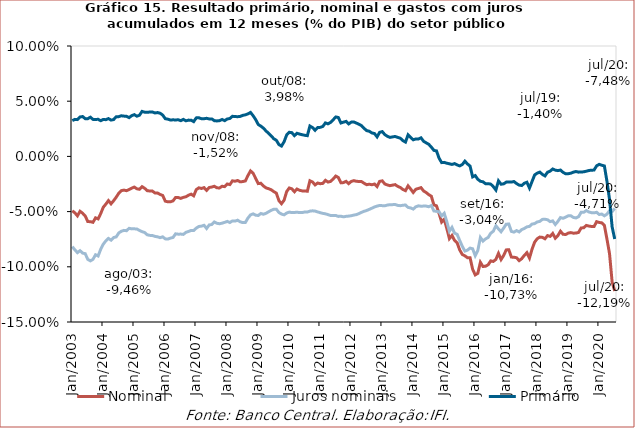
| Category | Nominal | Juros nominais | Primário |
|---|---|---|---|
| 2003-01-01 | -0.049 | -0.082 | 0.032 |
| 2003-02-01 | -0.051 | -0.085 | 0.034 |
| 2003-03-01 | -0.054 | -0.087 | 0.033 |
| 2003-04-01 | -0.05 | -0.085 | 0.036 |
| 2003-05-01 | -0.051 | -0.088 | 0.036 |
| 2003-06-01 | -0.054 | -0.088 | 0.034 |
| 2003-07-01 | -0.059 | -0.093 | 0.034 |
| 2003-08-01 | -0.059 | -0.095 | 0.036 |
| 2003-09-01 | -0.06 | -0.093 | 0.034 |
| 2003-10-01 | -0.056 | -0.089 | 0.033 |
| 2003-11-01 | -0.057 | -0.09 | 0.034 |
| 2003-12-01 | -0.052 | -0.084 | 0.032 |
| 2004-01-01 | -0.046 | -0.079 | 0.033 |
| 2004-02-01 | -0.043 | -0.076 | 0.033 |
| 2004-03-01 | -0.04 | -0.074 | 0.034 |
| 2004-04-01 | -0.043 | -0.076 | 0.033 |
| 2004-05-01 | -0.04 | -0.073 | 0.033 |
| 2004-06-01 | -0.037 | -0.073 | 0.036 |
| 2004-07-01 | -0.033 | -0.069 | 0.036 |
| 2004-08-01 | -0.031 | -0.068 | 0.037 |
| 2004-09-01 | -0.031 | -0.067 | 0.036 |
| 2004-10-01 | -0.031 | -0.067 | 0.036 |
| 2004-11-01 | -0.03 | -0.065 | 0.035 |
| 2004-12-01 | -0.029 | -0.066 | 0.037 |
| 2005-01-01 | -0.028 | -0.066 | 0.038 |
| 2005-02-01 | -0.029 | -0.066 | 0.036 |
| 2005-03-01 | -0.03 | -0.067 | 0.037 |
| 2005-04-01 | -0.027 | -0.068 | 0.041 |
| 2005-05-01 | -0.029 | -0.069 | 0.04 |
| 2005-06-01 | -0.031 | -0.071 | 0.04 |
| 2005-07-01 | -0.031 | -0.072 | 0.04 |
| 2005-08-01 | -0.031 | -0.072 | 0.04 |
| 2005-09-01 | -0.033 | -0.072 | 0.039 |
| 2005-10-01 | -0.033 | -0.073 | 0.04 |
| 2005-11-01 | -0.034 | -0.074 | 0.039 |
| 2005-12-01 | -0.035 | -0.073 | 0.037 |
| 2006-01-01 | -0.041 | -0.075 | 0.034 |
| 2006-02-01 | -0.041 | -0.075 | 0.034 |
| 2006-03-01 | -0.041 | -0.074 | 0.033 |
| 2006-04-01 | -0.04 | -0.073 | 0.033 |
| 2006-05-01 | -0.037 | -0.07 | 0.033 |
| 2006-06-01 | -0.037 | -0.07 | 0.033 |
| 2006-07-01 | -0.038 | -0.07 | 0.032 |
| 2006-08-01 | -0.037 | -0.071 | 0.034 |
| 2006-09-01 | -0.037 | -0.069 | 0.032 |
| 2006-10-01 | -0.035 | -0.068 | 0.033 |
| 2006-11-01 | -0.034 | -0.067 | 0.033 |
| 2006-12-01 | -0.036 | -0.067 | 0.032 |
| 2007-01-01 | -0.03 | -0.065 | 0.035 |
| 2007-02-01 | -0.028 | -0.063 | 0.035 |
| 2007-03-01 | -0.029 | -0.063 | 0.034 |
| 2007-04-01 | -0.028 | -0.062 | 0.034 |
| 2007-05-01 | -0.031 | -0.065 | 0.035 |
| 2007-06-01 | -0.028 | -0.062 | 0.034 |
| 2007-07-01 | -0.028 | -0.062 | 0.034 |
| 2007-08-01 | -0.027 | -0.059 | 0.032 |
| 2007-09-01 | -0.028 | -0.061 | 0.032 |
| 2007-10-01 | -0.029 | -0.061 | 0.032 |
| 2007-11-01 | -0.027 | -0.06 | 0.033 |
| 2007-12-01 | -0.027 | -0.06 | 0.032 |
| 2008-01-01 | -0.025 | -0.059 | 0.034 |
| 2008-02-01 | -0.026 | -0.06 | 0.034 |
| 2008-03-01 | -0.022 | -0.058 | 0.036 |
| 2008-04-01 | -0.022 | -0.059 | 0.036 |
| 2008-05-01 | -0.022 | -0.058 | 0.036 |
| 2008-06-01 | -0.023 | -0.059 | 0.036 |
| 2008-07-01 | -0.023 | -0.06 | 0.037 |
| 2008-08-01 | -0.022 | -0.06 | 0.038 |
| 2008-09-01 | -0.017 | -0.056 | 0.039 |
| 2008-10-01 | -0.013 | -0.053 | 0.04 |
| 2008-11-01 | -0.015 | -0.052 | 0.037 |
| 2008-12-01 | -0.02 | -0.053 | 0.033 |
| 2009-01-01 | -0.025 | -0.054 | 0.029 |
| 2009-02-01 | -0.024 | -0.052 | 0.027 |
| 2009-03-01 | -0.027 | -0.052 | 0.026 |
| 2009-04-01 | -0.029 | -0.052 | 0.023 |
| 2009-05-01 | -0.029 | -0.05 | 0.021 |
| 2009-06-01 | -0.03 | -0.049 | 0.019 |
| 2009-07-01 | -0.032 | -0.048 | 0.016 |
| 2009-08-01 | -0.033 | -0.048 | 0.015 |
| 2009-09-01 | -0.04 | -0.051 | 0.011 |
| 2009-10-01 | -0.043 | -0.052 | 0.009 |
| 2009-11-01 | -0.04 | -0.053 | 0.013 |
| 2009-12-01 | -0.032 | -0.051 | 0.019 |
| 2010-01-01 | -0.029 | -0.05 | 0.022 |
| 2010-02-01 | -0.029 | -0.051 | 0.022 |
| 2010-03-01 | -0.032 | -0.051 | 0.019 |
| 2010-04-01 | -0.03 | -0.051 | 0.021 |
| 2010-05-01 | -0.031 | -0.051 | 0.02 |
| 2010-06-01 | -0.031 | -0.051 | 0.02 |
| 2010-07-01 | -0.031 | -0.05 | 0.019 |
| 2010-08-01 | -0.032 | -0.05 | 0.019 |
| 2010-09-01 | -0.022 | -0.05 | 0.028 |
| 2010-10-01 | -0.023 | -0.049 | 0.026 |
| 2010-11-01 | -0.026 | -0.049 | 0.024 |
| 2010-12-01 | -0.024 | -0.05 | 0.026 |
| 2011-01-01 | -0.025 | -0.051 | 0.026 |
| 2011-02-01 | -0.024 | -0.052 | 0.027 |
| 2011-03-01 | -0.022 | -0.052 | 0.03 |
| 2011-04-01 | -0.023 | -0.053 | 0.029 |
| 2011-05-01 | -0.023 | -0.053 | 0.031 |
| 2011-06-01 | -0.02 | -0.054 | 0.033 |
| 2011-07-01 | -0.018 | -0.054 | 0.036 |
| 2011-08-01 | -0.019 | -0.054 | 0.035 |
| 2011-09-01 | -0.024 | -0.054 | 0.03 |
| 2011-10-01 | -0.024 | -0.055 | 0.031 |
| 2011-11-01 | -0.023 | -0.054 | 0.032 |
| 2011-12-01 | -0.025 | -0.054 | 0.029 |
| 2012-01-01 | -0.023 | -0.054 | 0.031 |
| 2012-02-01 | -0.022 | -0.053 | 0.031 |
| 2012-03-01 | -0.023 | -0.053 | 0.03 |
| 2012-04-01 | -0.023 | -0.052 | 0.029 |
| 2012-05-01 | -0.023 | -0.051 | 0.028 |
| 2012-06-01 | -0.024 | -0.05 | 0.025 |
| 2012-07-01 | -0.026 | -0.049 | 0.023 |
| 2012-08-01 | -0.025 | -0.048 | 0.023 |
| 2012-09-01 | -0.026 | -0.047 | 0.021 |
| 2012-10-01 | -0.025 | -0.046 | 0.021 |
| 2012-11-01 | -0.027 | -0.045 | 0.018 |
| 2012-12-01 | -0.023 | -0.044 | 0.022 |
| 2013-01-01 | -0.022 | -0.045 | 0.022 |
| 2013-02-01 | -0.025 | -0.045 | 0.02 |
| 2013-03-01 | -0.026 | -0.044 | 0.018 |
| 2013-04-01 | -0.027 | -0.044 | 0.017 |
| 2013-05-01 | -0.026 | -0.044 | 0.018 |
| 2013-06-01 | -0.026 | -0.044 | 0.018 |
| 2013-07-01 | -0.027 | -0.044 | 0.017 |
| 2013-08-01 | -0.028 | -0.045 | 0.016 |
| 2013-09-01 | -0.03 | -0.044 | 0.014 |
| 2013-10-01 | -0.031 | -0.044 | 0.013 |
| 2013-11-01 | -0.027 | -0.046 | 0.02 |
| 2013-12-01 | -0.03 | -0.047 | 0.017 |
| 2014-01-01 | -0.033 | -0.048 | 0.015 |
| 2014-02-01 | -0.03 | -0.046 | 0.016 |
| 2014-03-01 | -0.029 | -0.045 | 0.016 |
| 2014-04-01 | -0.028 | -0.045 | 0.017 |
| 2014-05-01 | -0.031 | -0.045 | 0.014 |
| 2014-06-01 | -0.033 | -0.045 | 0.012 |
| 2014-07-01 | -0.035 | -0.046 | 0.011 |
| 2014-08-01 | -0.036 | -0.044 | 0.008 |
| 2014-09-01 | -0.044 | -0.049 | 0.005 |
| 2014-10-01 | -0.045 | -0.05 | 0.005 |
| 2014-11-01 | -0.052 | -0.05 | -0.002 |
| 2014-12-01 | -0.06 | -0.054 | -0.006 |
| 2015-01-01 | -0.057 | -0.052 | -0.005 |
| 2015-02-01 | -0.065 | -0.059 | -0.006 |
| 2015-03-01 | -0.074 | -0.068 | -0.007 |
| 2015-04-01 | -0.072 | -0.064 | -0.007 |
| 2015-05-01 | -0.076 | -0.07 | -0.007 |
| 2015-06-01 | -0.078 | -0.071 | -0.008 |
| 2015-07-01 | -0.085 | -0.076 | -0.009 |
| 2015-08-01 | -0.089 | -0.082 | -0.007 |
| 2015-09-01 | -0.09 | -0.086 | -0.004 |
| 2015-10-01 | -0.092 | -0.085 | -0.007 |
| 2015-11-01 | -0.092 | -0.083 | -0.009 |
| 2015-12-01 | -0.102 | -0.084 | -0.019 |
| 2016-01-01 | -0.107 | -0.09 | -0.017 |
| 2016-02-01 | -0.106 | -0.085 | -0.021 |
| 2016-03-01 | -0.096 | -0.073 | -0.023 |
| 2016-04-01 | -0.1 | -0.077 | -0.023 |
| 2016-05-01 | -0.099 | -0.075 | -0.025 |
| 2016-06-01 | -0.098 | -0.073 | -0.025 |
| 2016-07-01 | -0.095 | -0.07 | -0.025 |
| 2016-08-01 | -0.095 | -0.068 | -0.027 |
| 2016-09-01 | -0.093 | -0.063 | -0.03 |
| 2016-10-01 | -0.088 | -0.066 | -0.022 |
| 2016-11-01 | -0.093 | -0.068 | -0.025 |
| 2016-12-01 | -0.09 | -0.065 | -0.025 |
| 2017-01-01 | -0.085 | -0.061 | -0.023 |
| 2017-02-01 | -0.085 | -0.061 | -0.023 |
| 2017-03-01 | -0.091 | -0.068 | -0.023 |
| 2017-04-01 | -0.091 | -0.069 | -0.023 |
| 2017-05-01 | -0.092 | -0.067 | -0.025 |
| 2017-06-01 | -0.094 | -0.068 | -0.026 |
| 2017-07-01 | -0.093 | -0.066 | -0.026 |
| 2017-08-01 | -0.09 | -0.065 | -0.024 |
| 2017-09-01 | -0.087 | -0.064 | -0.023 |
| 2017-10-01 | -0.092 | -0.063 | -0.029 |
| 2017-11-01 | -0.084 | -0.061 | -0.023 |
| 2017-12-01 | -0.078 | -0.061 | -0.017 |
| 2018-01-01 | -0.075 | -0.059 | -0.015 |
| 2018-02-01 | -0.073 | -0.059 | -0.014 |
| 2018-03-01 | -0.073 | -0.057 | -0.016 |
| 2018-04-01 | -0.075 | -0.057 | -0.018 |
| 2018-05-01 | -0.072 | -0.057 | -0.014 |
| 2018-06-01 | -0.072 | -0.059 | -0.013 |
| 2018-07-01 | -0.07 | -0.058 | -0.011 |
| 2018-08-01 | -0.074 | -0.062 | -0.012 |
| 2018-09-01 | -0.072 | -0.059 | -0.013 |
| 2018-10-01 | -0.068 | -0.055 | -0.012 |
| 2018-11-01 | -0.071 | -0.056 | -0.014 |
| 2018-12-01 | -0.071 | -0.055 | -0.016 |
| 2019-01-01 | -0.069 | -0.054 | -0.016 |
| 2019-02-01 | -0.069 | -0.054 | -0.015 |
| 2019-03-01 | -0.07 | -0.055 | -0.014 |
| 2019-04-01 | -0.069 | -0.056 | -0.014 |
| 2019-05-01 | -0.069 | -0.055 | -0.014 |
| 2019-06-01 | -0.065 | -0.051 | -0.014 |
| 2019-07-01 | -0.065 | -0.051 | -0.014 |
| 2019-08-01 | -0.063 | -0.049 | -0.013 |
| 2019-09-01 | -0.063 | -0.05 | -0.013 |
| 2019-10-01 | -0.063 | -0.051 | -0.012 |
| 2019-11-01 | -0.064 | -0.051 | -0.012 |
| 2019-12-01 | -0.059 | -0.051 | -0.009 |
| 2020-01-01 | -0.06 | -0.053 | -0.007 |
| 2020-02-01 | -0.06 | -0.052 | -0.008 |
| 2020-03-01 | -0.062 | -0.054 | -0.009 |
| 2020-04-01 | -0.075 | -0.052 | -0.023 |
| 2020-05-01 | -0.088 | -0.049 | -0.039 |
| 2020-06-01 | -0.114 | -0.05 | -0.064 |
| 2020-07-01 | -0.122 | -0.047 | -0.075 |